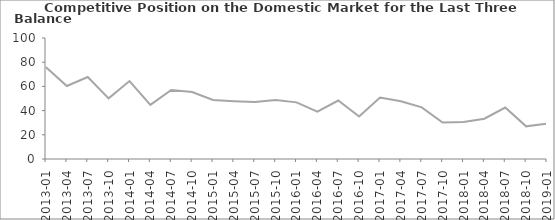
| Category | Balance |
|---|---|
| 2013-01 | 75.9 |
| 2013-04 | 60.3 |
| 2013-07 | 67.8 |
| 2013-10 | 50.1 |
| 2014-01 | 64.4 |
| 2014-04 | 44.8 |
| 2014-07 | 57.1 |
| 2014-10 | 55.4 |
| 2015-01 | 48.8 |
| 2015-04 | 47.8 |
| 2015-07 | 47.1 |
| 2015-10 | 48.8 |
| 2016-01 | 46.8 |
| 2016-04 | 39.1 |
| 2016-07 | 48.3 |
| 2016-10 | 35.1 |
| 2017-01 | 50.8 |
| 2017-04 | 47.7 |
| 2017-07 | 42.7 |
| 2017-10 | 30.2 |
| 2018-01 | 30.6 |
| 2018-04 | 33.3 |
| 2018-07 | 42.5 |
| 2018-10 | 27 |
| 2019-01 | 29.2 |